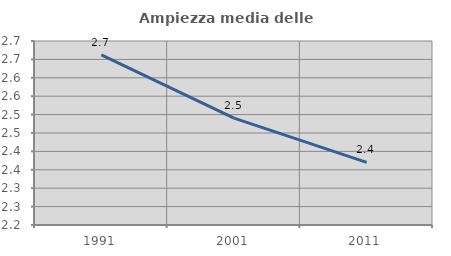
| Category | Ampiezza media delle famiglie |
|---|---|
| 1991.0 | 2.662 |
| 2001.0 | 2.491 |
| 2011.0 | 2.37 |